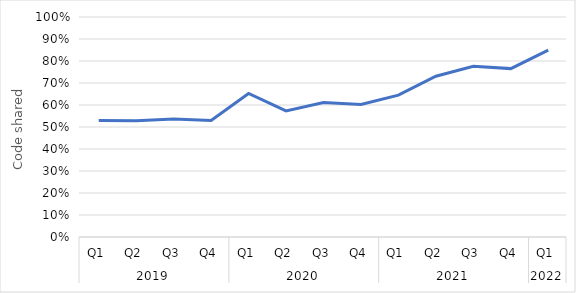
| Category | Code sharing rate |
|---|---|
| 0 | 0.529 |
| 1 | 0.529 |
| 2 | 0.537 |
| 3 | 0.53 |
| 4 | 0.652 |
| 5 | 0.573 |
| 6 | 0.611 |
| 7 | 0.603 |
| 8 | 0.645 |
| 9 | 0.731 |
| 10 | 0.776 |
| 11 | 0.765 |
| 12 | 0.85 |